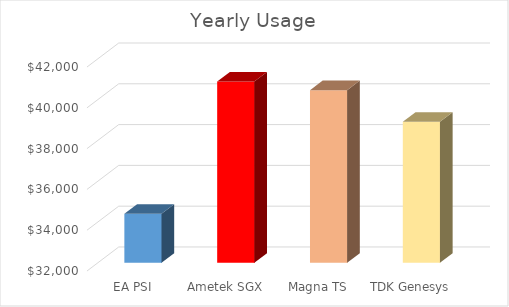
| Category | Series 0 |
|---|---|
| EA PSI | 34403.611 |
| Ametek SGX | 40888.889 |
| Magna TS | 40465.116 |
| TDK Genesys | 38911.035 |